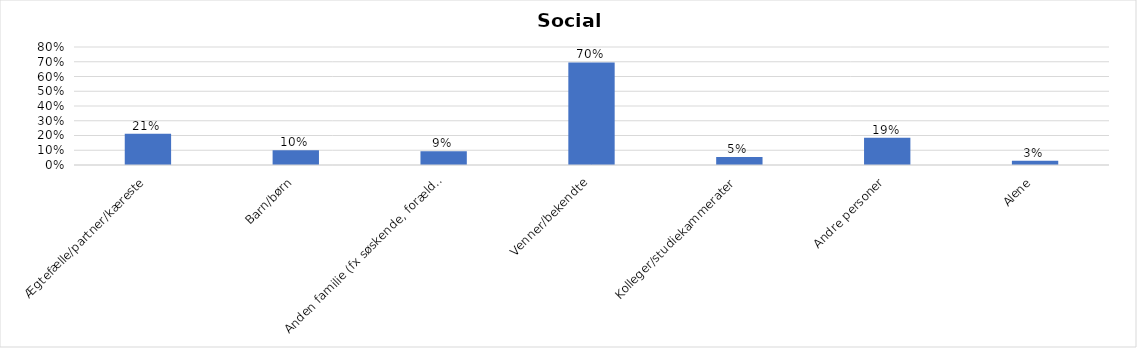
| Category | % |
|---|---|
| Ægtefælle/partner/kæreste | 0.212 |
| Barn/børn | 0.1 |
| Anden familie (fx søskende, forældre) | 0.094 |
| Venner/bekendte | 0.696 |
| Kolleger/studiekammerater | 0.054 |
| Andre personer | 0.185 |
| Alene | 0.029 |